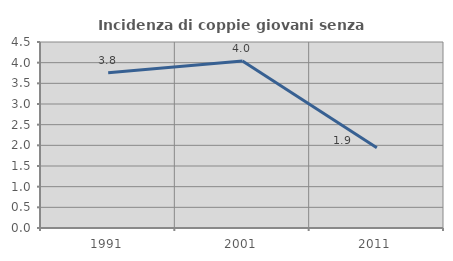
| Category | Incidenza di coppie giovani senza figli |
|---|---|
| 1991.0 | 3.757 |
| 2001.0 | 4.043 |
| 2011.0 | 1.944 |